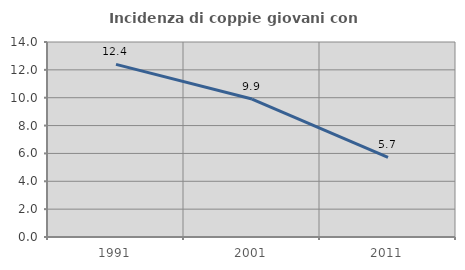
| Category | Incidenza di coppie giovani con figli |
|---|---|
| 1991.0 | 12.392 |
| 2001.0 | 9.906 |
| 2011.0 | 5.718 |